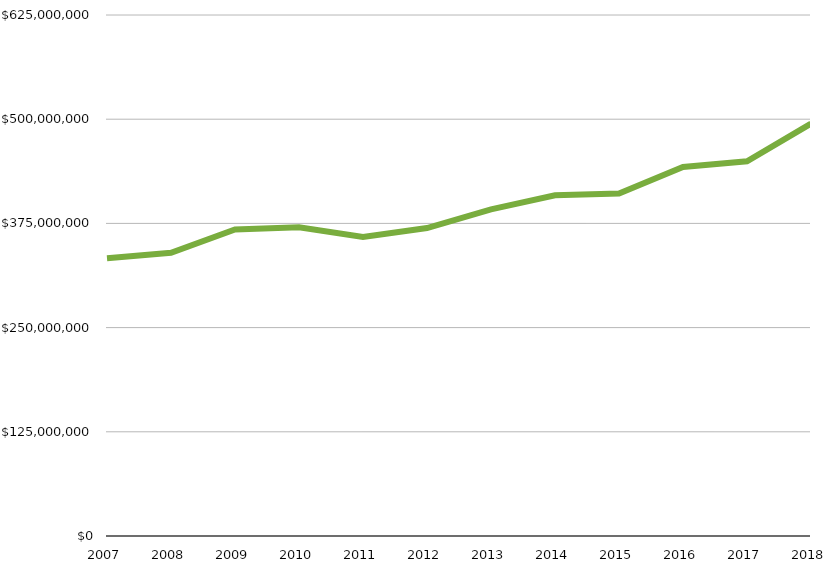
| Category | Total Budget |
|---|---|
| 2007 | 333101865 |
| 2008 | 339685844 |
| 2009 | 367806712 |
| 2010 | 370287471 |
| 2011 | 358791418 |
| 2012 | 369394753 |
| 2013 | 391834829 |
| 2014 | 408806234.75 |
| 2015 | 410989546.2 |
| 2016 | 442730568.39 |
| 2017 | 449482373.22 |
| 2018 | 494652025 |